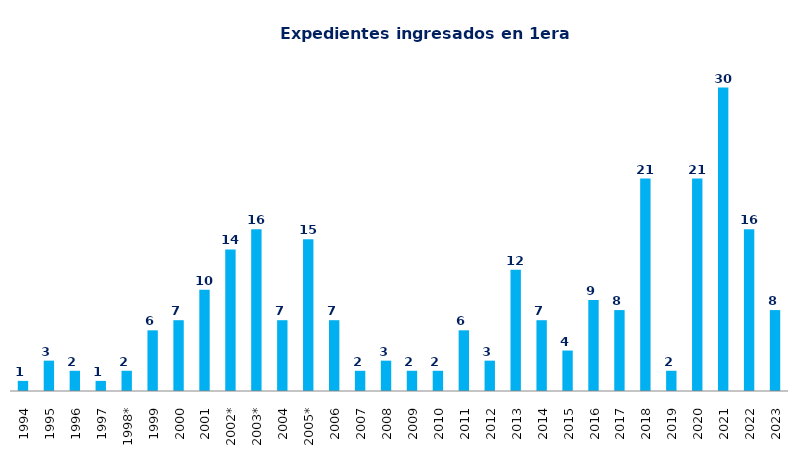
| Category | Ingresados |
|---|---|
| 1994 | 1 |
| 1995 | 3 |
| 1996 | 2 |
| 1997 | 1 |
| 1998* | 2 |
| 1999 | 6 |
| 2000 | 7 |
| 2001 | 10 |
| 2002* | 14 |
| 2003* | 16 |
| 2004 | 7 |
| 2005* | 15 |
| 2006 | 7 |
| 2007 | 2 |
| 2008 | 3 |
| 2009 | 2 |
| 2010 | 2 |
| 2011 | 6 |
| 2012 | 3 |
| 2013 | 12 |
| 2014 | 7 |
| 2015 | 4 |
| 2016 | 9 |
| 2017 | 8 |
| 2018 | 21 |
| 2019 | 2 |
| 2020 | 21 |
| 2021 | 30 |
| 2022 | 16 |
| 2023 | 8 |